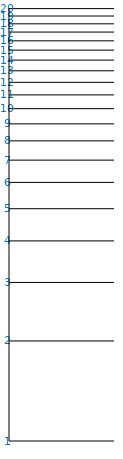
| Category | Series 0 |
|---|---|
| 0.0 | 0 |
| 0.0 | 0.693 |
| 0.0 | 1.099 |
| 0.0 | 1.386 |
| 0.0 | 1.609 |
| 0.0 | 1.792 |
| 0.0 | 1.946 |
| 0.0 | 2.079 |
| 0.0 | 2.197 |
| 0.0 | 2.303 |
| 0.0 | 2.398 |
| 0.0 | 2.485 |
| 0.0 | 2.565 |
| 0.0 | 2.639 |
| 0.0 | 2.708 |
| 0.0 | 2.773 |
| 0.0 | 2.833 |
| 0.0 | 2.89 |
| 0.0 | 2.944 |
| 0.0 | 2.996 |
| 0.0 | 3.045 |
| 0.0 | 3.091 |
| 0.0 | 3.135 |
| 0.0 | 3.178 |
| 0.0 | 3.219 |
| 0.0 | 3.258 |
| 0.0 | 3.296 |